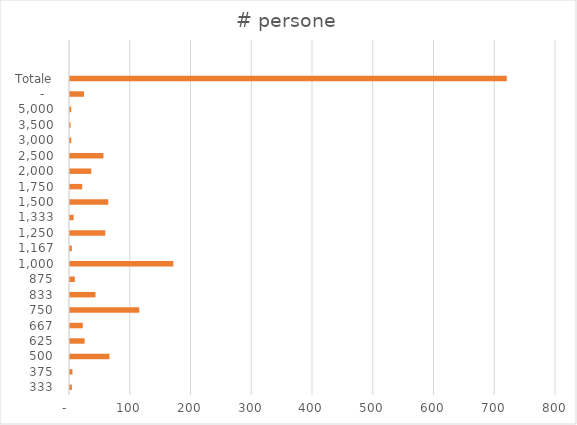
| Category | # persone |
|---|---|
|  333  | 3 |
|  375  | 4 |
|  500  | 65 |
|  625  | 24 |
|  667  | 21 |
|  750  | 114 |
|  833  | 42 |
|  875  | 8 |
|  1.000  | 170 |
|  1.167  | 3 |
|  1.250  | 58 |
|  1.333  | 6 |
|  1.500  | 63 |
|  1.750  | 20 |
|  2.000  | 35 |
|  2.500  | 55 |
|  3.000  | 2 |
|  3.500  | 1 |
|  5.000  | 2 |
|  -    | 23 |
|  Totale  | 719 |